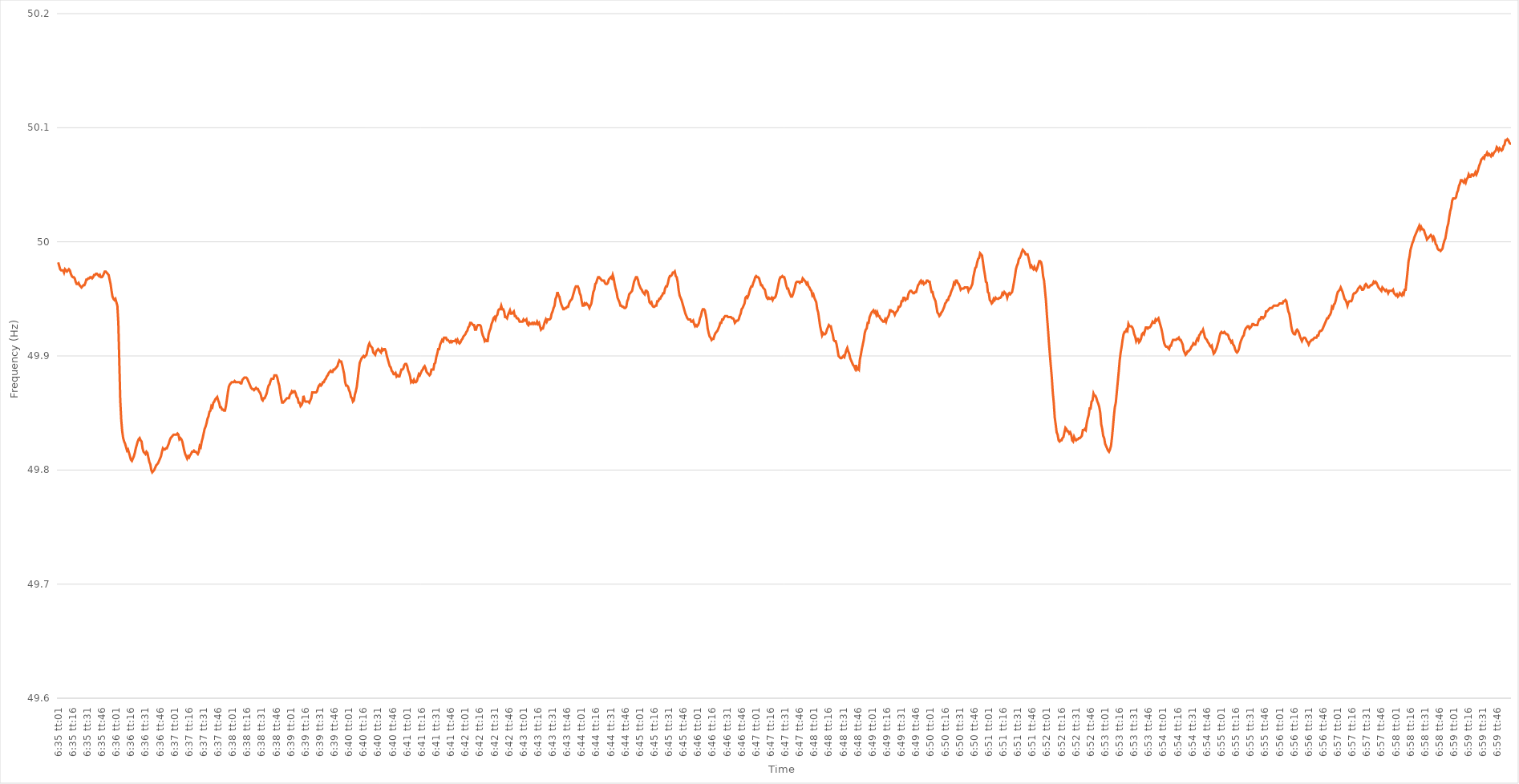
| Category | Series 0 |
|---|---|
| 0.2743171296296296 | 49.982 |
| 0.2743287037037037 | 49.979 |
| 0.27434027777777775 | 49.976 |
| 0.27435185185185185 | 49.975 |
| 0.27436342592592594 | 49.975 |
| 0.274375 | 49.975 |
| 0.2743865740740741 | 49.973 |
| 0.27439814814814817 | 49.976 |
| 0.2744097222222222 | 49.975 |
| 0.2744212962962963 | 49.974 |
| 0.2744328703703704 | 49.975 |
| 0.27444444444444444 | 49.976 |
| 0.27445601851851853 | 49.975 |
| 0.2744675925925926 | 49.972 |
| 0.27447916666666666 | 49.97 |
| 0.2744907407407407 | 49.969 |
| 0.27450231481481485 | 49.969 |
| 0.2745138888888889 | 49.968 |
| 0.274525462962963 | 49.965 |
| 0.274537037037037 | 49.963 |
| 0.2745486111111111 | 49.963 |
| 0.27456018518518516 | 49.964 |
| 0.27457175925925925 | 49.962 |
| 0.27458333333333335 | 49.961 |
| 0.2745949074074074 | 49.96 |
| 0.2746064814814815 | 49.961 |
| 0.2746180555555556 | 49.962 |
| 0.2746296296296296 | 49.962 |
| 0.2746412037037037 | 49.964 |
| 0.2746527777777778 | 49.967 |
| 0.27466435185185184 | 49.967 |
| 0.27467592592592593 | 49.968 |
| 0.27468750000000003 | 49.968 |
| 0.27469907407407407 | 49.969 |
| 0.27471064814814816 | 49.969 |
| 0.27472222222222226 | 49.968 |
| 0.2747337962962963 | 49.969 |
| 0.2747453703703704 | 49.971 |
| 0.27475694444444443 | 49.971 |
| 0.2747685185185185 | 49.972 |
| 0.27478009259259256 | 49.972 |
| 0.27479166666666666 | 49.971 |
| 0.27480324074074075 | 49.97 |
| 0.2748148148148148 | 49.971 |
| 0.2748263888888889 | 49.969 |
| 0.274837962962963 | 49.969 |
| 0.274849537037037 | 49.97 |
| 0.2748611111111111 | 49.972 |
| 0.2748726851851852 | 49.974 |
| 0.27488425925925924 | 49.974 |
| 0.27489583333333334 | 49.973 |
| 0.27490740740740743 | 49.972 |
| 0.2749189814814815 | 49.971 |
| 0.27493055555555557 | 49.967 |
| 0.27494212962962966 | 49.963 |
| 0.2749537037037037 | 49.957 |
| 0.2749652777777778 | 49.952 |
| 0.27497685185185183 | 49.95 |
| 0.27498842592592593 | 49.949 |
| 0.27499999999999997 | 49.95 |
| 0.27501157407407406 | 49.947 |
| 0.27502314814814816 | 49.944 |
| 0.2750347222222222 | 49.929 |
| 0.2750462962962963 | 49.895 |
| 0.2750578703703704 | 49.861 |
| 0.2750694444444444 | 49.844 |
| 0.2750810185185185 | 49.834 |
| 0.2750925925925926 | 49.828 |
| 0.27510416666666665 | 49.825 |
| 0.27511574074074074 | 49.823 |
| 0.27512731481481484 | 49.82 |
| 0.2751388888888889 | 49.817 |
| 0.27515046296296297 | 49.818 |
| 0.27516203703703707 | 49.815 |
| 0.2751736111111111 | 49.812 |
| 0.2751851851851852 | 49.809 |
| 0.27519675925925924 | 49.808 |
| 0.27520833333333333 | 49.81 |
| 0.27521990740740737 | 49.812 |
| 0.2752314814814815 | 49.815 |
| 0.27524305555555556 | 49.819 |
| 0.2752546296296296 | 49.822 |
| 0.2752662037037037 | 49.825 |
| 0.2752777777777778 | 49.827 |
| 0.2752893518518518 | 49.828 |
| 0.2753009259259259 | 49.826 |
| 0.2753125 | 49.825 |
| 0.27532407407407405 | 49.819 |
| 0.27533564814814815 | 49.816 |
| 0.27534722222222224 | 49.815 |
| 0.2753587962962963 | 49.814 |
| 0.2753703703703704 | 49.816 |
| 0.27538194444444447 | 49.815 |
| 0.2753935185185185 | 49.811 |
| 0.2754050925925926 | 49.807 |
| 0.2754166666666667 | 49.805 |
| 0.27542824074074074 | 49.8 |
| 0.2754398148148148 | 49.798 |
| 0.2754513888888889 | 49.799 |
| 0.27546296296296297 | 49.8 |
| 0.275474537037037 | 49.802 |
| 0.2754861111111111 | 49.804 |
| 0.2754976851851852 | 49.805 |
| 0.27550925925925923 | 49.806 |
| 0.2755208333333333 | 49.808 |
| 0.2755324074074074 | 49.81 |
| 0.27554398148148146 | 49.812 |
| 0.27555555555555555 | 49.816 |
| 0.27556712962962965 | 49.819 |
| 0.2755787037037037 | 49.818 |
| 0.2755902777777778 | 49.818 |
| 0.2756018518518519 | 49.819 |
| 0.2756134259259259 | 49.819 |
| 0.275625 | 49.821 |
| 0.2756365740740741 | 49.823 |
| 0.27564814814814814 | 49.826 |
| 0.27565972222222224 | 49.828 |
| 0.27567129629629633 | 49.829 |
| 0.27568287037037037 | 49.83 |
| 0.27569444444444446 | 49.831 |
| 0.2757060185185185 | 49.831 |
| 0.2757175925925926 | 49.831 |
| 0.27572916666666664 | 49.831 |
| 0.27574074074074073 | 49.832 |
| 0.2757523148148148 | 49.831 |
| 0.27576388888888886 | 49.827 |
| 0.27577546296296296 | 49.828 |
| 0.27578703703703705 | 49.827 |
| 0.2757986111111111 | 49.825 |
| 0.2758101851851852 | 49.821 |
| 0.2758217592592593 | 49.817 |
| 0.2758333333333333 | 49.814 |
| 0.2758449074074074 | 49.812 |
| 0.2758564814814815 | 49.81 |
| 0.27586805555555555 | 49.812 |
| 0.27587962962962964 | 49.811 |
| 0.27589120370370374 | 49.813 |
| 0.2759027777777778 | 49.814 |
| 0.27591435185185187 | 49.816 |
| 0.2759259259259259 | 49.816 |
| 0.2759375 | 49.817 |
| 0.27594907407407404 | 49.816 |
| 0.27596064814814814 | 49.816 |
| 0.27597222222222223 | 49.815 |
| 0.27598379629629627 | 49.814 |
| 0.27599537037037036 | 49.816 |
| 0.27600694444444446 | 49.821 |
| 0.2760185185185185 | 49.82 |
| 0.2760300925925926 | 49.825 |
| 0.2760416666666667 | 49.828 |
| 0.2760532407407407 | 49.832 |
| 0.2760648148148148 | 49.836 |
| 0.2760763888888889 | 49.838 |
| 0.27608796296296295 | 49.841 |
| 0.27609953703703705 | 49.845 |
| 0.27611111111111114 | 49.847 |
| 0.2761226851851852 | 49.851 |
| 0.2761342592592593 | 49.852 |
| 0.2761458333333333 | 49.856 |
| 0.2761574074074074 | 49.855 |
| 0.27616898148148145 | 49.859 |
| 0.2761805555555556 | 49.86 |
| 0.27619212962962963 | 49.862 |
| 0.2762037037037037 | 49.863 |
| 0.27621527777777777 | 49.864 |
| 0.27622685185185186 | 49.861 |
| 0.2762384259259259 | 49.859 |
| 0.27625 | 49.855 |
| 0.2762615740740741 | 49.855 |
| 0.27627314814814813 | 49.853 |
| 0.2762847222222222 | 49.853 |
| 0.2762962962962963 | 49.852 |
| 0.27630787037037036 | 49.852 |
| 0.27631944444444445 | 49.856 |
| 0.27633101851851855 | 49.862 |
| 0.2763425925925926 | 49.868 |
| 0.2763541666666667 | 49.873 |
| 0.2763657407407408 | 49.875 |
| 0.2763773148148148 | 49.876 |
| 0.27638888888888885 | 49.877 |
| 0.276400462962963 | 49.877 |
| 0.27641203703703704 | 49.877 |
| 0.2764236111111111 | 49.878 |
| 0.2764351851851852 | 49.877 |
| 0.27644675925925927 | 49.877 |
| 0.2764583333333333 | 49.877 |
| 0.2764699074074074 | 49.877 |
| 0.2764814814814815 | 49.877 |
| 0.27649305555555553 | 49.876 |
| 0.27650462962962963 | 49.876 |
| 0.2765162037037037 | 49.879 |
| 0.27652777777777776 | 49.88 |
| 0.27653935185185186 | 49.881 |
| 0.27655092592592595 | 49.881 |
| 0.2765625 | 49.881 |
| 0.2765740740740741 | 49.88 |
| 0.2765856481481482 | 49.878 |
| 0.2765972222222222 | 49.876 |
| 0.2766087962962963 | 49.874 |
| 0.2766203703703704 | 49.872 |
| 0.27663194444444444 | 49.871 |
| 0.27664351851851854 | 49.871 |
| 0.2766550925925926 | 49.87 |
| 0.27666666666666667 | 49.871 |
| 0.2766782407407407 | 49.872 |
| 0.2766898148148148 | 49.871 |
| 0.2767013888888889 | 49.871 |
| 0.27671296296296294 | 49.869 |
| 0.27672453703703703 | 49.868 |
| 0.2767361111111111 | 49.866 |
| 0.27674768518518517 | 49.862 |
| 0.27675925925925926 | 49.861 |
| 0.27677083333333335 | 49.863 |
| 0.2767824074074074 | 49.863 |
| 0.2767939814814815 | 49.865 |
| 0.2768055555555556 | 49.867 |
| 0.2768171296296296 | 49.871 |
| 0.2768287037037037 | 49.874 |
| 0.2768402777777778 | 49.875 |
| 0.27685185185185185 | 49.878 |
| 0.27686342592592594 | 49.88 |
| 0.276875 | 49.88 |
| 0.2768865740740741 | 49.88 |
| 0.2768981481481481 | 49.883 |
| 0.2769097222222222 | 49.883 |
| 0.2769212962962963 | 49.883 |
| 0.27693287037037034 | 49.881 |
| 0.27694444444444444 | 49.877 |
| 0.27695601851851853 | 49.874 |
| 0.27696759259259257 | 49.868 |
| 0.27697916666666667 | 49.863 |
| 0.27699074074074076 | 49.859 |
| 0.2770023148148148 | 49.859 |
| 0.2770138888888889 | 49.86 |
| 0.277025462962963 | 49.861 |
| 0.277037037037037 | 49.862 |
| 0.2770486111111111 | 49.863 |
| 0.2770601851851852 | 49.863 |
| 0.27707175925925925 | 49.863 |
| 0.27708333333333335 | 49.866 |
| 0.2770949074074074 | 49.867 |
| 0.2771064814814815 | 49.869 |
| 0.2771180555555555 | 49.868 |
| 0.27712962962962967 | 49.869 |
| 0.2771412037037037 | 49.869 |
| 0.27715277777777775 | 49.867 |
| 0.27716435185185184 | 49.864 |
| 0.27717592592592594 | 49.863 |
| 0.2771875 | 49.859 |
| 0.27719907407407407 | 49.859 |
| 0.27721064814814816 | 49.856 |
| 0.2772222222222222 | 49.857 |
| 0.2772337962962963 | 49.859 |
| 0.2772453703703704 | 49.865 |
| 0.27725694444444443 | 49.861 |
| 0.2772685185185185 | 49.86 |
| 0.2772800925925926 | 49.86 |
| 0.27729166666666666 | 49.86 |
| 0.27730324074074075 | 49.86 |
| 0.27731481481481485 | 49.859 |
| 0.2773263888888889 | 49.861 |
| 0.2773379629629629 | 49.863 |
| 0.2773495370370371 | 49.868 |
| 0.2773611111111111 | 49.868 |
| 0.27737268518518515 | 49.868 |
| 0.27738425925925925 | 49.868 |
| 0.27739583333333334 | 49.868 |
| 0.2774074074074074 | 49.869 |
| 0.2774189814814815 | 49.872 |
| 0.27743055555555557 | 49.874 |
| 0.2774421296296296 | 49.875 |
| 0.2774537037037037 | 49.874 |
| 0.2774652777777778 | 49.875 |
| 0.27747685185185184 | 49.877 |
| 0.27748842592592593 | 49.877 |
| 0.2775 | 49.879 |
| 0.27751157407407406 | 49.88 |
| 0.27752314814814816 | 49.882 |
| 0.27753472222222225 | 49.883 |
| 0.2775462962962963 | 49.885 |
| 0.27755787037037033 | 49.886 |
| 0.2775694444444445 | 49.887 |
| 0.2775810185185185 | 49.886 |
| 0.2775925925925926 | 49.886 |
| 0.27760416666666665 | 49.888 |
| 0.27761574074074075 | 49.888 |
| 0.2776273148148148 | 49.889 |
| 0.2776388888888889 | 49.89 |
| 0.277650462962963 | 49.891 |
| 0.277662037037037 | 49.894 |
| 0.2776736111111111 | 49.896 |
| 0.2776851851851852 | 49.895 |
| 0.27769675925925924 | 49.895 |
| 0.27770833333333333 | 49.892 |
| 0.27771990740740743 | 49.888 |
| 0.27773148148148147 | 49.884 |
| 0.27774305555555556 | 49.877 |
| 0.27775462962962966 | 49.874 |
| 0.2777662037037037 | 49.874 |
| 0.2777777777777778 | 49.873 |
| 0.2777893518518519 | 49.87 |
| 0.2778009259259259 | 49.868 |
| 0.2778125 | 49.864 |
| 0.27782407407407406 | 49.863 |
| 0.27783564814814815 | 49.86 |
| 0.2778472222222222 | 49.861 |
| 0.2778587962962963 | 49.866 |
| 0.2778703703703704 | 49.869 |
| 0.2778819444444444 | 49.873 |
| 0.2778935185185185 | 49.88 |
| 0.2779050925925926 | 49.887 |
| 0.27791666666666665 | 49.894 |
| 0.27792824074074074 | 49.896 |
| 0.27793981481481483 | 49.898 |
| 0.2779513888888889 | 49.899 |
| 0.27796296296296297 | 49.9 |
| 0.27797453703703706 | 49.899 |
| 0.2779861111111111 | 49.9 |
| 0.2779976851851852 | 49.901 |
| 0.2780092592592593 | 49.905 |
| 0.27802083333333333 | 49.909 |
| 0.2780324074074074 | 49.911 |
| 0.27804398148148146 | 49.909 |
| 0.27805555555555556 | 49.908 |
| 0.2780671296296296 | 49.907 |
| 0.2780787037037037 | 49.903 |
| 0.2780902777777778 | 49.902 |
| 0.2781018518518518 | 49.901 |
| 0.2781134259259259 | 49.904 |
| 0.278125 | 49.905 |
| 0.27813657407407405 | 49.906 |
| 0.27814814814814814 | 49.905 |
| 0.27815972222222224 | 49.904 |
| 0.2781712962962963 | 49.903 |
| 0.27818287037037037 | 49.906 |
| 0.27819444444444447 | 49.905 |
| 0.2782060185185185 | 49.906 |
| 0.2782175925925926 | 49.906 |
| 0.2782291666666667 | 49.904 |
| 0.27824074074074073 | 49.9 |
| 0.2782523148148148 | 49.897 |
| 0.2782638888888889 | 49.894 |
| 0.27827546296296296 | 49.891 |
| 0.278287037037037 | 49.89 |
| 0.27829861111111115 | 49.887 |
| 0.2783101851851852 | 49.886 |
| 0.2783217592592592 | 49.884 |
| 0.2783333333333333 | 49.884 |
| 0.2783449074074074 | 49.885 |
| 0.27835648148148145 | 49.882 |
| 0.27836805555555555 | 49.883 |
| 0.27837962962962964 | 49.882 |
| 0.2783912037037037 | 49.882 |
| 0.2784027777777778 | 49.885 |
| 0.27841435185185187 | 49.888 |
| 0.2784259259259259 | 49.888 |
| 0.2784375 | 49.889 |
| 0.2784490740740741 | 49.892 |
| 0.27846064814814814 | 49.893 |
| 0.27847222222222223 | 49.893 |
| 0.2784837962962963 | 49.891 |
| 0.27849537037037037 | 49.887 |
| 0.2785069444444444 | 49.885 |
| 0.27851851851851855 | 49.882 |
| 0.2785300925925926 | 49.877 |
| 0.2785416666666667 | 49.878 |
| 0.2785532407407407 | 49.877 |
| 0.2785648148148148 | 49.879 |
| 0.27857638888888886 | 49.877 |
| 0.27858796296296295 | 49.877 |
| 0.27859953703703705 | 49.878 |
| 0.2786111111111111 | 49.881 |
| 0.2786226851851852 | 49.884 |
| 0.2786342592592593 | 49.883 |
| 0.2786458333333333 | 49.885 |
| 0.2786574074074074 | 49.887 |
| 0.2786689814814815 | 49.888 |
| 0.27868055555555554 | 49.89 |
| 0.27869212962962964 | 49.891 |
| 0.27870370370370373 | 49.889 |
| 0.27871527777777777 | 49.886 |
| 0.27872685185185186 | 49.885 |
| 0.27873842592592596 | 49.884 |
| 0.27875 | 49.883 |
| 0.2787615740740741 | 49.884 |
| 0.27877314814814813 | 49.888 |
| 0.2787847222222222 | 49.888 |
| 0.27879629629629626 | 49.888 |
| 0.27880787037037036 | 49.893 |
| 0.27881944444444445 | 49.894 |
| 0.2788310185185185 | 49.899 |
| 0.2788425925925926 | 49.902 |
| 0.2788541666666667 | 49.906 |
| 0.2788657407407407 | 49.906 |
| 0.2788773148148148 | 49.91 |
| 0.2788888888888889 | 49.912 |
| 0.27890046296296295 | 49.914 |
| 0.27891203703703704 | 49.913 |
| 0.27892361111111114 | 49.916 |
| 0.2789351851851852 | 49.916 |
| 0.27894675925925927 | 49.916 |
| 0.27895833333333336 | 49.914 |
| 0.2789699074074074 | 49.914 |
| 0.2789814814814815 | 49.913 |
| 0.27899305555555554 | 49.912 |
| 0.27900462962962963 | 49.913 |
| 0.27901620370370367 | 49.912 |
| 0.27902777777777776 | 49.913 |
| 0.27903935185185186 | 49.913 |
| 0.2790509259259259 | 49.913 |
| 0.2790625 | 49.914 |
| 0.2790740740740741 | 49.912 |
| 0.2790856481481481 | 49.914 |
| 0.2790972222222222 | 49.912 |
| 0.2791087962962963 | 49.911 |
| 0.27912037037037035 | 49.912 |
| 0.27913194444444445 | 49.914 |
| 0.27914351851851854 | 49.915 |
| 0.2791550925925926 | 49.917 |
| 0.2791666666666667 | 49.918 |
| 0.27917824074074077 | 49.919 |
| 0.2791898148148148 | 49.921 |
| 0.2792013888888889 | 49.922 |
| 0.279212962962963 | 49.925 |
| 0.27922453703703703 | 49.926 |
| 0.2792361111111111 | 49.929 |
| 0.2792476851851852 | 49.929 |
| 0.27925925925925926 | 49.928 |
| 0.2792708333333333 | 49.927 |
| 0.2792824074074074 | 49.927 |
| 0.2792939814814815 | 49.923 |
| 0.27930555555555553 | 49.923 |
| 0.2793171296296296 | 49.926 |
| 0.2793287037037037 | 49.927 |
| 0.27934027777777776 | 49.927 |
| 0.27935185185185185 | 49.927 |
| 0.27936342592592595 | 49.926 |
| 0.279375 | 49.921 |
| 0.2793865740740741 | 49.918 |
| 0.2793981481481482 | 49.916 |
| 0.2794097222222222 | 49.913 |
| 0.2794212962962963 | 49.914 |
| 0.2794328703703704 | 49.913 |
| 0.27944444444444444 | 49.913 |
| 0.2794560185185185 | 49.919 |
| 0.27946759259259263 | 49.922 |
| 0.27947916666666667 | 49.924 |
| 0.27949074074074076 | 49.928 |
| 0.2795023148148148 | 49.93 |
| 0.2795138888888889 | 49.933 |
| 0.27952546296296293 | 49.934 |
| 0.27953703703703703 | 49.932 |
| 0.2795486111111111 | 49.935 |
| 0.27956018518518516 | 49.936 |
| 0.27957175925925926 | 49.94 |
| 0.27958333333333335 | 49.941 |
| 0.2795949074074074 | 49.941 |
| 0.2796064814814815 | 49.944 |
| 0.2796180555555556 | 49.941 |
| 0.2796296296296296 | 49.941 |
| 0.2796412037037037 | 49.939 |
| 0.2796527777777778 | 49.934 |
| 0.27966435185185184 | 49.934 |
| 0.27967592592592594 | 49.933 |
| 0.27968750000000003 | 49.936 |
| 0.27969907407407407 | 49.938 |
| 0.27971064814814817 | 49.94 |
| 0.2797222222222222 | 49.937 |
| 0.2797337962962963 | 49.937 |
| 0.27974537037037034 | 49.938 |
| 0.27975694444444443 | 49.939 |
| 0.2797685185185185 | 49.935 |
| 0.27978009259259257 | 49.935 |
| 0.27979166666666666 | 49.933 |
| 0.27980324074074076 | 49.933 |
| 0.2798148148148148 | 49.932 |
| 0.2798263888888889 | 49.93 |
| 0.279837962962963 | 49.93 |
| 0.279849537037037 | 49.93 |
| 0.2798611111111111 | 49.93 |
| 0.2798726851851852 | 49.932 |
| 0.27988425925925925 | 49.931 |
| 0.27989583333333334 | 49.931 |
| 0.27990740740740744 | 49.932 |
| 0.2799189814814815 | 49.928 |
| 0.27993055555555557 | 49.927 |
| 0.2799421296296296 | 49.929 |
| 0.2799537037037037 | 49.928 |
| 0.27996527777777774 | 49.928 |
| 0.27997685185185184 | 49.929 |
| 0.27998842592592593 | 49.928 |
| 0.27999999999999997 | 49.929 |
| 0.28001157407407407 | 49.928 |
| 0.28002314814814816 | 49.928 |
| 0.2800347222222222 | 49.93 |
| 0.2800462962962963 | 49.928 |
| 0.2800578703703704 | 49.929 |
| 0.2800694444444444 | 49.926 |
| 0.2800810185185185 | 49.923 |
| 0.2800925925925926 | 49.924 |
| 0.28010416666666665 | 49.924 |
| 0.28011574074074075 | 49.927 |
| 0.28012731481481484 | 49.93 |
| 0.2801388888888889 | 49.932 |
| 0.280150462962963 | 49.93 |
| 0.280162037037037 | 49.932 |
| 0.2801736111111111 | 49.932 |
| 0.28018518518518515 | 49.932 |
| 0.2801967592592593 | 49.933 |
| 0.28020833333333334 | 49.937 |
| 0.2802199074074074 | 49.939 |
| 0.28023148148148147 | 49.942 |
| 0.28024305555555556 | 49.944 |
| 0.2802546296296296 | 49.95 |
| 0.2802662037037037 | 49.952 |
| 0.2802777777777778 | 49.956 |
| 0.28028935185185183 | 49.953 |
| 0.2803009259259259 | 49.952 |
| 0.2803125 | 49.948 |
| 0.28032407407407406 | 49.945 |
| 0.28033564814814815 | 49.943 |
| 0.28034722222222225 | 49.941 |
| 0.2803587962962963 | 49.941 |
| 0.2803703703703704 | 49.942 |
| 0.2803819444444445 | 49.942 |
| 0.2803935185185185 | 49.943 |
| 0.28040509259259255 | 49.943 |
| 0.2804166666666667 | 49.946 |
| 0.28042824074074074 | 49.948 |
| 0.28043981481481484 | 49.949 |
| 0.2804513888888889 | 49.95 |
| 0.28046296296296297 | 49.953 |
| 0.280474537037037 | 49.956 |
| 0.2804861111111111 | 49.959 |
| 0.2804976851851852 | 49.961 |
| 0.28050925925925924 | 49.961 |
| 0.28052083333333333 | 49.961 |
| 0.2805324074074074 | 49.959 |
| 0.28054398148148146 | 49.955 |
| 0.28055555555555556 | 49.953 |
| 0.28056712962962965 | 49.948 |
| 0.2805787037037037 | 49.944 |
| 0.2805902777777778 | 49.944 |
| 0.2806018518518519 | 49.946 |
| 0.2806134259259259 | 49.945 |
| 0.280625 | 49.946 |
| 0.2806365740740741 | 49.945 |
| 0.28064814814814815 | 49.944 |
| 0.28065972222222224 | 49.942 |
| 0.2806712962962963 | 49.944 |
| 0.2806828703703704 | 49.946 |
| 0.2806944444444444 | 49.951 |
| 0.2807060185185185 | 49.956 |
| 0.2807175925925926 | 49.958 |
| 0.28072916666666664 | 49.963 |
| 0.28074074074074074 | 49.964 |
| 0.28075231481481483 | 49.967 |
| 0.28076388888888887 | 49.969 |
| 0.28077546296296296 | 49.969 |
| 0.28078703703703706 | 49.968 |
| 0.2807986111111111 | 49.967 |
| 0.2808101851851852 | 49.966 |
| 0.2808217592592593 | 49.966 |
| 0.2808333333333333 | 49.966 |
| 0.2808449074074074 | 49.964 |
| 0.2808564814814815 | 49.963 |
| 0.28086805555555555 | 49.963 |
| 0.28087962962962965 | 49.964 |
| 0.2808912037037037 | 49.967 |
| 0.2809027777777778 | 49.968 |
| 0.2809143518518518 | 49.969 |
| 0.2809259259259259 | 49.968 |
| 0.2809375 | 49.971 |
| 0.28094907407407405 | 49.968 |
| 0.28096064814814814 | 49.963 |
| 0.28097222222222223 | 49.959 |
| 0.2809837962962963 | 49.956 |
| 0.28099537037037037 | 49.951 |
| 0.28100694444444446 | 49.949 |
| 0.2810185185185185 | 49.947 |
| 0.2810300925925926 | 49.944 |
| 0.2810416666666667 | 49.944 |
| 0.28105324074074073 | 49.943 |
| 0.2810648148148148 | 49.943 |
| 0.2810763888888889 | 49.942 |
| 0.28108796296296296 | 49.942 |
| 0.28109953703703705 | 49.943 |
| 0.2811111111111111 | 49.948 |
| 0.2811226851851852 | 49.95 |
| 0.2811342592592592 | 49.954 |
| 0.2811458333333334 | 49.955 |
| 0.2811574074074074 | 49.956 |
| 0.28116898148148145 | 49.957 |
| 0.28118055555555554 | 49.961 |
| 0.28119212962962964 | 49.965 |
| 0.2812037037037037 | 49.967 |
| 0.2812152777777778 | 49.969 |
| 0.28122685185185187 | 49.969 |
| 0.2812384259259259 | 49.967 |
| 0.28125 | 49.963 |
| 0.2812615740740741 | 49.961 |
| 0.28127314814814813 | 49.959 |
| 0.2812847222222222 | 49.958 |
| 0.2812962962962963 | 49.956 |
| 0.28130787037037036 | 49.955 |
| 0.28131944444444446 | 49.954 |
| 0.28133101851851855 | 49.957 |
| 0.2813425925925926 | 49.957 |
| 0.2813541666666666 | 49.956 |
| 0.2813657407407408 | 49.952 |
| 0.2813773148148148 | 49.947 |
| 0.2813888888888889 | 49.946 |
| 0.28140046296296295 | 49.947 |
| 0.28141203703703704 | 49.944 |
| 0.2814236111111111 | 49.943 |
| 0.2814351851851852 | 49.943 |
| 0.28144675925925927 | 49.944 |
| 0.2814583333333333 | 49.944 |
| 0.2814699074074074 | 49.948 |
| 0.2814814814814815 | 49.948 |
| 0.28149305555555554 | 49.95 |
| 0.28150462962962963 | 49.95 |
| 0.2815162037037037 | 49.952 |
| 0.28152777777777777 | 49.953 |
| 0.28153935185185186 | 49.955 |
| 0.28155092592592595 | 49.955 |
| 0.2815625 | 49.959 |
| 0.2815740740740741 | 49.961 |
| 0.2815856481481482 | 49.961 |
| 0.2815972222222222 | 49.964 |
| 0.2816087962962963 | 49.968 |
| 0.28162037037037035 | 49.97 |
| 0.28163194444444445 | 49.97 |
| 0.2816435185185185 | 49.971 |
| 0.2816550925925926 | 49.973 |
| 0.2816666666666667 | 49.973 |
| 0.2816782407407407 | 49.974 |
| 0.2816898148148148 | 49.97 |
| 0.2817013888888889 | 49.969 |
| 0.28171296296296294 | 49.965 |
| 0.28172453703703704 | 49.958 |
| 0.28173611111111113 | 49.953 |
| 0.28174768518518517 | 49.951 |
| 0.28175925925925926 | 49.949 |
| 0.28177083333333336 | 49.946 |
| 0.2817824074074074 | 49.943 |
| 0.2817939814814815 | 49.94 |
| 0.2818055555555556 | 49.937 |
| 0.2818171296296296 | 49.935 |
| 0.2818287037037037 | 49.933 |
| 0.28184027777777776 | 49.932 |
| 0.28185185185185185 | 49.932 |
| 0.2818634259259259 | 49.932 |
| 0.281875 | 49.93 |
| 0.2818865740740741 | 49.93 |
| 0.2818981481481481 | 49.931 |
| 0.2819097222222222 | 49.928 |
| 0.2819212962962963 | 49.926 |
| 0.28193287037037035 | 49.927 |
| 0.28194444444444444 | 49.926 |
| 0.28195601851851854 | 49.927 |
| 0.2819675925925926 | 49.929 |
| 0.28197916666666667 | 49.933 |
| 0.28199074074074076 | 49.935 |
| 0.2820023148148148 | 49.939 |
| 0.2820138888888889 | 49.941 |
| 0.282025462962963 | 49.941 |
| 0.28203703703703703 | 49.94 |
| 0.2820486111111111 | 49.936 |
| 0.28206018518518516 | 49.931 |
| 0.28207175925925926 | 49.924 |
| 0.2820833333333333 | 49.92 |
| 0.28209490740740745 | 49.917 |
| 0.2821064814814815 | 49.916 |
| 0.2821180555555555 | 49.914 |
| 0.2821296296296296 | 49.915 |
| 0.2821412037037037 | 49.915 |
| 0.28215277777777775 | 49.918 |
| 0.28216435185185185 | 49.92 |
| 0.28217592592592594 | 49.921 |
| 0.2821875 | 49.922 |
| 0.2821990740740741 | 49.924 |
| 0.28221064814814817 | 49.926 |
| 0.2822222222222222 | 49.929 |
| 0.2822337962962963 | 49.929 |
| 0.2822453703703704 | 49.932 |
| 0.28225694444444444 | 49.932 |
| 0.28226851851851853 | 49.934 |
| 0.2822800925925926 | 49.935 |
| 0.28229166666666666 | 49.935 |
| 0.2823032407407407 | 49.935 |
| 0.28231481481481485 | 49.934 |
| 0.2823263888888889 | 49.934 |
| 0.282337962962963 | 49.934 |
| 0.282349537037037 | 49.934 |
| 0.2823611111111111 | 49.933 |
| 0.28237268518518516 | 49.933 |
| 0.28238425925925925 | 49.932 |
| 0.28239583333333335 | 49.929 |
| 0.2824074074074074 | 49.93 |
| 0.2824189814814815 | 49.931 |
| 0.2824305555555556 | 49.931 |
| 0.2824421296296296 | 49.932 |
| 0.2824537037037037 | 49.935 |
| 0.2824652777777778 | 49.937 |
| 0.28247685185185184 | 49.941 |
| 0.28248842592592593 | 49.942 |
| 0.28250000000000003 | 49.944 |
| 0.28251157407407407 | 49.946 |
| 0.28252314814814816 | 49.951 |
| 0.28253472222222226 | 49.952 |
| 0.2825462962962963 | 49.951 |
| 0.2825578703703704 | 49.953 |
| 0.28256944444444443 | 49.956 |
| 0.2825810185185185 | 49.959 |
| 0.28259259259259256 | 49.961 |
| 0.28260416666666666 | 49.961 |
| 0.28261574074074075 | 49.964 |
| 0.2826273148148148 | 49.966 |
| 0.2826388888888889 | 49.969 |
| 0.282650462962963 | 49.97 |
| 0.282662037037037 | 49.969 |
| 0.2826736111111111 | 49.969 |
| 0.2826851851851852 | 49.968 |
| 0.28269675925925924 | 49.965 |
| 0.28270833333333334 | 49.962 |
| 0.28271990740740743 | 49.962 |
| 0.2827314814814815 | 49.96 |
| 0.28274305555555557 | 49.959 |
| 0.28275462962962966 | 49.958 |
| 0.2827662037037037 | 49.954 |
| 0.2827777777777778 | 49.951 |
| 0.28278935185185183 | 49.95 |
| 0.28280092592592593 | 49.951 |
| 0.28281249999999997 | 49.95 |
| 0.28282407407407406 | 49.95 |
| 0.28283564814814816 | 49.951 |
| 0.2828472222222222 | 49.949 |
| 0.2828587962962963 | 49.951 |
| 0.2828703703703704 | 49.951 |
| 0.2828819444444444 | 49.952 |
| 0.2828935185185185 | 49.955 |
| 0.2829050925925926 | 49.959 |
| 0.28291666666666665 | 49.963 |
| 0.28292824074074074 | 49.967 |
| 0.28293981481481484 | 49.969 |
| 0.2829513888888889 | 49.969 |
| 0.28296296296296297 | 49.97 |
| 0.28297453703703707 | 49.969 |
| 0.2829861111111111 | 49.969 |
| 0.2829976851851852 | 49.966 |
| 0.28300925925925924 | 49.962 |
| 0.28302083333333333 | 49.959 |
| 0.28303240740740737 | 49.959 |
| 0.2830439814814815 | 49.956 |
| 0.28305555555555556 | 49.954 |
| 0.2830671296296296 | 49.952 |
| 0.2830787037037037 | 49.952 |
| 0.2830902777777778 | 49.954 |
| 0.2831018518518518 | 49.957 |
| 0.2831134259259259 | 49.96 |
| 0.283125 | 49.964 |
| 0.28313657407407405 | 49.965 |
| 0.28314814814814815 | 49.965 |
| 0.28315972222222224 | 49.965 |
| 0.2831712962962963 | 49.964 |
| 0.2831828703703704 | 49.965 |
| 0.28319444444444447 | 49.965 |
| 0.2832060185185185 | 49.968 |
| 0.2832175925925926 | 49.967 |
| 0.2832291666666667 | 49.966 |
| 0.28324074074074074 | 49.965 |
| 0.2832523148148148 | 49.963 |
| 0.2832638888888889 | 49.964 |
| 0.28327546296296297 | 49.961 |
| 0.283287037037037 | 49.96 |
| 0.2832986111111111 | 49.958 |
| 0.2833101851851852 | 49.957 |
| 0.28332175925925923 | 49.953 |
| 0.2833333333333333 | 49.954 |
| 0.2833449074074074 | 49.951 |
| 0.28335648148148146 | 49.949 |
| 0.28336805555555555 | 49.947 |
| 0.28337962962962965 | 49.941 |
| 0.2833912037037037 | 49.938 |
| 0.2834027777777778 | 49.932 |
| 0.2834143518518519 | 49.926 |
| 0.2834259259259259 | 49.922 |
| 0.2834375 | 49.918 |
| 0.2834490740740741 | 49.92 |
| 0.28346064814814814 | 49.919 |
| 0.28347222222222224 | 49.919 |
| 0.28348379629629633 | 49.92 |
| 0.28349537037037037 | 49.923 |
| 0.28350694444444446 | 49.925 |
| 0.2835185185185185 | 49.927 |
| 0.2835300925925926 | 49.926 |
| 0.28354166666666664 | 49.926 |
| 0.28355324074074073 | 49.922 |
| 0.2835648148148148 | 49.919 |
| 0.28357638888888886 | 49.914 |
| 0.28358796296296296 | 49.913 |
| 0.28359953703703705 | 49.913 |
| 0.2836111111111111 | 49.91 |
| 0.2836226851851852 | 49.905 |
| 0.2836342592592593 | 49.9 |
| 0.2836458333333333 | 49.899 |
| 0.2836574074074074 | 49.898 |
| 0.2836689814814815 | 49.898 |
| 0.28368055555555555 | 49.899 |
| 0.28369212962962964 | 49.9 |
| 0.28370370370370374 | 49.899 |
| 0.2837152777777778 | 49.902 |
| 0.28372685185185187 | 49.905 |
| 0.2837384259259259 | 49.907 |
| 0.28375 | 49.904 |
| 0.28376157407407404 | 49.902 |
| 0.28377314814814814 | 49.898 |
| 0.28378472222222223 | 49.896 |
| 0.28379629629629627 | 49.894 |
| 0.28380787037037036 | 49.892 |
| 0.28381944444444446 | 49.891 |
| 0.2838310185185185 | 49.889 |
| 0.2838425925925926 | 49.892 |
| 0.2838541666666667 | 49.888 |
| 0.2838657407407407 | 49.889 |
| 0.2838773148148148 | 49.888 |
| 0.2838888888888889 | 49.897 |
| 0.28390046296296295 | 49.901 |
| 0.28391203703703705 | 49.906 |
| 0.28392361111111114 | 49.91 |
| 0.2839351851851852 | 49.914 |
| 0.2839467592592593 | 49.92 |
| 0.2839583333333333 | 49.923 |
| 0.2839699074074074 | 49.924 |
| 0.28398148148148145 | 49.929 |
| 0.2839930555555556 | 49.929 |
| 0.28400462962962963 | 49.934 |
| 0.2840162037037037 | 49.936 |
| 0.28402777777777777 | 49.938 |
| 0.28403935185185186 | 49.939 |
| 0.2840509259259259 | 49.94 |
| 0.2840625 | 49.938 |
| 0.2840740740740741 | 49.939 |
| 0.28408564814814813 | 49.936 |
| 0.2840972222222222 | 49.938 |
| 0.2841087962962963 | 49.935 |
| 0.28412037037037036 | 49.935 |
| 0.28413194444444445 | 49.933 |
| 0.28414351851851855 | 49.932 |
| 0.2841550925925926 | 49.931 |
| 0.2841666666666667 | 49.93 |
| 0.2841782407407408 | 49.93 |
| 0.2841898148148148 | 49.932 |
| 0.28420138888888885 | 49.93 |
| 0.284212962962963 | 49.933 |
| 0.28422453703703704 | 49.934 |
| 0.2842361111111111 | 49.936 |
| 0.2842476851851852 | 49.94 |
| 0.28425925925925927 | 49.94 |
| 0.2842708333333333 | 49.939 |
| 0.2842824074074074 | 49.939 |
| 0.2842939814814815 | 49.938 |
| 0.28430555555555553 | 49.936 |
| 0.28431712962962963 | 49.938 |
| 0.2843287037037037 | 49.939 |
| 0.28434027777777776 | 49.94 |
| 0.28435185185185186 | 49.943 |
| 0.28436342592592595 | 49.943 |
| 0.284375 | 49.944 |
| 0.2843865740740741 | 49.948 |
| 0.2843981481481482 | 49.948 |
| 0.2844097222222222 | 49.951 |
| 0.2844212962962963 | 49.951 |
| 0.2844328703703704 | 49.949 |
| 0.28444444444444444 | 49.95 |
| 0.28445601851851854 | 49.95 |
| 0.2844675925925926 | 49.954 |
| 0.28447916666666667 | 49.956 |
| 0.2844907407407407 | 49.957 |
| 0.2845023148148148 | 49.957 |
| 0.2845138888888889 | 49.956 |
| 0.28452546296296294 | 49.955 |
| 0.28453703703703703 | 49.955 |
| 0.2845486111111111 | 49.956 |
| 0.28456018518518517 | 49.956 |
| 0.28457175925925926 | 49.959 |
| 0.28458333333333335 | 49.962 |
| 0.2845949074074074 | 49.963 |
| 0.2846064814814815 | 49.965 |
| 0.2846180555555556 | 49.966 |
| 0.2846296296296296 | 49.964 |
| 0.2846412037037037 | 49.965 |
| 0.2846527777777778 | 49.963 |
| 0.28466435185185185 | 49.964 |
| 0.28467592592592594 | 49.964 |
| 0.2846875 | 49.966 |
| 0.2846990740740741 | 49.966 |
| 0.2847106481481481 | 49.965 |
| 0.2847222222222222 | 49.965 |
| 0.2847337962962963 | 49.96 |
| 0.28474537037037034 | 49.956 |
| 0.28475694444444444 | 49.956 |
| 0.28476851851851853 | 49.952 |
| 0.28478009259259257 | 49.95 |
| 0.28479166666666667 | 49.948 |
| 0.28480324074074076 | 49.943 |
| 0.2848148148148148 | 49.938 |
| 0.2848263888888889 | 49.937 |
| 0.284837962962963 | 49.935 |
| 0.284849537037037 | 49.936 |
| 0.2848611111111111 | 49.938 |
| 0.2848726851851852 | 49.939 |
| 0.28488425925925925 | 49.941 |
| 0.28489583333333335 | 49.943 |
| 0.2849074074074074 | 49.946 |
| 0.2849189814814815 | 49.947 |
| 0.2849305555555555 | 49.949 |
| 0.28494212962962967 | 49.949 |
| 0.2849537037037037 | 49.952 |
| 0.28496527777777775 | 49.953 |
| 0.28497685185185184 | 49.956 |
| 0.28498842592592594 | 49.958 |
| 0.285 | 49.96 |
| 0.28501157407407407 | 49.964 |
| 0.28502314814814816 | 49.963 |
| 0.2850347222222222 | 49.966 |
| 0.2850462962962963 | 49.966 |
| 0.2850578703703704 | 49.964 |
| 0.28506944444444443 | 49.963 |
| 0.2850810185185185 | 49.961 |
| 0.2850925925925926 | 49.958 |
| 0.28510416666666666 | 49.959 |
| 0.28511574074074075 | 49.959 |
| 0.28512731481481485 | 49.959 |
| 0.2851388888888889 | 49.96 |
| 0.2851504629629629 | 49.96 |
| 0.2851620370370371 | 49.96 |
| 0.2851736111111111 | 49.96 |
| 0.28518518518518515 | 49.957 |
| 0.28519675925925925 | 49.959 |
| 0.28520833333333334 | 49.959 |
| 0.2852199074074074 | 49.961 |
| 0.2852314814814815 | 49.963 |
| 0.28524305555555557 | 49.969 |
| 0.2852546296296296 | 49.973 |
| 0.2852662037037037 | 49.977 |
| 0.2852777777777778 | 49.978 |
| 0.28528935185185184 | 49.982 |
| 0.28530092592592593 | 49.985 |
| 0.2853125 | 49.986 |
| 0.28532407407407406 | 49.99 |
| 0.28533564814814816 | 49.989 |
| 0.28534722222222225 | 49.988 |
| 0.2853587962962963 | 49.982 |
| 0.28537037037037033 | 49.976 |
| 0.2853819444444445 | 49.971 |
| 0.2853935185185185 | 49.965 |
| 0.2854050925925926 | 49.964 |
| 0.28541666666666665 | 49.956 |
| 0.28542824074074075 | 49.955 |
| 0.2854398148148148 | 49.949 |
| 0.2854513888888889 | 49.948 |
| 0.285462962962963 | 49.946 |
| 0.285474537037037 | 49.947 |
| 0.2854861111111111 | 49.95 |
| 0.2854976851851852 | 49.949 |
| 0.28550925925925924 | 49.951 |
| 0.28552083333333333 | 49.95 |
| 0.28553240740740743 | 49.95 |
| 0.28554398148148147 | 49.95 |
| 0.28555555555555556 | 49.951 |
| 0.28556712962962966 | 49.951 |
| 0.2855787037037037 | 49.952 |
| 0.2855902777777778 | 49.955 |
| 0.2856018518518519 | 49.954 |
| 0.2856134259259259 | 49.956 |
| 0.285625 | 49.955 |
| 0.28563657407407406 | 49.954 |
| 0.28564814814814815 | 49.951 |
| 0.2856597222222222 | 49.954 |
| 0.2856712962962963 | 49.955 |
| 0.2856828703703704 | 49.954 |
| 0.2856944444444444 | 49.955 |
| 0.2857060185185185 | 49.956 |
| 0.2857175925925926 | 49.96 |
| 0.28572916666666665 | 49.965 |
| 0.28574074074074074 | 49.97 |
| 0.28575231481481483 | 49.976 |
| 0.2857638888888889 | 49.979 |
| 0.28577546296296297 | 49.981 |
| 0.28578703703703706 | 49.985 |
| 0.2857986111111111 | 49.986 |
| 0.2858101851851852 | 49.988 |
| 0.2858217592592593 | 49.991 |
| 0.28583333333333333 | 49.993 |
| 0.2858449074074074 | 49.992 |
| 0.28585648148148146 | 49.991 |
| 0.28586805555555556 | 49.989 |
| 0.2858796296296296 | 49.989 |
| 0.2858912037037037 | 49.989 |
| 0.2859027777777778 | 49.986 |
| 0.2859143518518518 | 49.982 |
| 0.2859259259259259 | 49.978 |
| 0.2859375 | 49.979 |
| 0.28594907407407405 | 49.977 |
| 0.28596064814814814 | 49.976 |
| 0.28597222222222224 | 49.978 |
| 0.2859837962962963 | 49.976 |
| 0.28599537037037037 | 49.975 |
| 0.28600694444444447 | 49.977 |
| 0.2860185185185185 | 49.98 |
| 0.2860300925925926 | 49.983 |
| 0.2860416666666667 | 49.983 |
| 0.28605324074074073 | 49.982 |
| 0.2860648148148148 | 49.978 |
| 0.2860763888888889 | 49.97 |
| 0.28608796296296296 | 49.966 |
| 0.286099537037037 | 49.957 |
| 0.28611111111111115 | 49.948 |
| 0.2861226851851852 | 49.935 |
| 0.2861342592592592 | 49.924 |
| 0.2861458333333333 | 49.912 |
| 0.2861574074074074 | 49.901 |
| 0.28616898148148145 | 49.891 |
| 0.28618055555555555 | 49.881 |
| 0.28619212962962964 | 49.868 |
| 0.2862037037037037 | 49.859 |
| 0.2862152777777778 | 49.846 |
| 0.28622685185185187 | 49.84 |
| 0.2862384259259259 | 49.833 |
| 0.28625 | 49.831 |
| 0.2862615740740741 | 49.826 |
| 0.28627314814814814 | 49.825 |
| 0.28628472222222223 | 49.826 |
| 0.2862962962962963 | 49.826 |
| 0.28630787037037037 | 49.828 |
| 0.2863194444444444 | 49.829 |
| 0.28633101851851855 | 49.833 |
| 0.2863425925925926 | 49.837 |
| 0.2863541666666667 | 49.836 |
| 0.2863657407407407 | 49.834 |
| 0.2863773148148148 | 49.834 |
| 0.28638888888888886 | 49.832 |
| 0.28640046296296295 | 49.833 |
| 0.28641203703703705 | 49.831 |
| 0.2864236111111111 | 49.826 |
| 0.2864351851851852 | 49.825 |
| 0.2864467592592593 | 49.829 |
| 0.2864583333333333 | 49.827 |
| 0.2864699074074074 | 49.826 |
| 0.2864814814814815 | 49.827 |
| 0.28649305555555554 | 49.827 |
| 0.28650462962962964 | 49.828 |
| 0.28651620370370373 | 49.828 |
| 0.28652777777777777 | 49.829 |
| 0.28653935185185186 | 49.83 |
| 0.28655092592592596 | 49.835 |
| 0.2865625 | 49.835 |
| 0.2865740740740741 | 49.836 |
| 0.28658564814814813 | 49.835 |
| 0.2865972222222222 | 49.841 |
| 0.28660879629629626 | 49.845 |
| 0.28662037037037036 | 49.848 |
| 0.28663194444444445 | 49.854 |
| 0.2866435185185185 | 49.854 |
| 0.2866550925925926 | 49.86 |
| 0.2866666666666667 | 49.861 |
| 0.2866782407407407 | 49.867 |
| 0.2866898148148148 | 49.865 |
| 0.2867013888888889 | 49.865 |
| 0.28671296296296295 | 49.863 |
| 0.28672453703703704 | 49.86 |
| 0.28673611111111114 | 49.858 |
| 0.2867476851851852 | 49.855 |
| 0.28675925925925927 | 49.85 |
| 0.28677083333333336 | 49.84 |
| 0.2867824074074074 | 49.836 |
| 0.2867939814814815 | 49.83 |
| 0.28680555555555554 | 49.828 |
| 0.28681712962962963 | 49.823 |
| 0.28682870370370367 | 49.821 |
| 0.28684027777777776 | 49.819 |
| 0.28685185185185186 | 49.817 |
| 0.2868634259259259 | 49.816 |
| 0.286875 | 49.818 |
| 0.2868865740740741 | 49.821 |
| 0.2868981481481481 | 49.828 |
| 0.2869097222222222 | 49.837 |
| 0.2869212962962963 | 49.847 |
| 0.28693287037037035 | 49.855 |
| 0.28694444444444445 | 49.859 |
| 0.28695601851851854 | 49.868 |
| 0.2869675925925926 | 49.877 |
| 0.2869791666666667 | 49.886 |
| 0.28699074074074077 | 49.896 |
| 0.2870023148148148 | 49.903 |
| 0.2870138888888889 | 49.908 |
| 0.287025462962963 | 49.914 |
| 0.28703703703703703 | 49.919 |
| 0.2870486111111111 | 49.921 |
| 0.2870601851851852 | 49.921 |
| 0.28707175925925926 | 49.923 |
| 0.2870833333333333 | 49.922 |
| 0.2870949074074074 | 49.928 |
| 0.2871064814814815 | 49.926 |
| 0.28711805555555553 | 49.926 |
| 0.2871296296296296 | 49.926 |
| 0.2871412037037037 | 49.925 |
| 0.28715277777777776 | 49.923 |
| 0.28716435185185185 | 49.919 |
| 0.28717592592592595 | 49.917 |
| 0.2871875 | 49.913 |
| 0.2871990740740741 | 49.915 |
| 0.2872106481481482 | 49.915 |
| 0.2872222222222222 | 49.912 |
| 0.2872337962962963 | 49.913 |
| 0.2872453703703704 | 49.915 |
| 0.28725694444444444 | 49.919 |
| 0.2872685185185185 | 49.92 |
| 0.28728009259259263 | 49.919 |
| 0.28729166666666667 | 49.922 |
| 0.28730324074074076 | 49.925 |
| 0.2873148148148148 | 49.925 |
| 0.2873263888888889 | 49.924 |
| 0.28733796296296293 | 49.925 |
| 0.28734953703703703 | 49.925 |
| 0.2873611111111111 | 49.926 |
| 0.28737268518518516 | 49.928 |
| 0.28738425925925926 | 49.93 |
| 0.28739583333333335 | 49.929 |
| 0.2874074074074074 | 49.929 |
| 0.2874189814814815 | 49.932 |
| 0.2874305555555556 | 49.931 |
| 0.2874421296296296 | 49.932 |
| 0.2874537037037037 | 49.933 |
| 0.2874652777777778 | 49.93 |
| 0.28747685185185184 | 49.927 |
| 0.28748842592592594 | 49.924 |
| 0.28750000000000003 | 49.92 |
| 0.28751157407407407 | 49.915 |
| 0.28752314814814817 | 49.911 |
| 0.2875347222222222 | 49.909 |
| 0.2875462962962963 | 49.908 |
| 0.28755787037037034 | 49.908 |
| 0.28756944444444443 | 49.907 |
| 0.2875810185185185 | 49.906 |
| 0.28759259259259257 | 49.909 |
| 0.28760416666666666 | 49.909 |
| 0.28761574074074076 | 49.912 |
| 0.2876273148148148 | 49.914 |
| 0.2876388888888889 | 49.914 |
| 0.287650462962963 | 49.914 |
| 0.287662037037037 | 49.914 |
| 0.2876736111111111 | 49.915 |
| 0.2876851851851852 | 49.915 |
| 0.28769675925925925 | 49.916 |
| 0.28770833333333334 | 49.914 |
| 0.28771990740740744 | 49.914 |
| 0.2877314814814815 | 49.912 |
| 0.28774305555555557 | 49.91 |
| 0.2877546296296296 | 49.905 |
| 0.2877662037037037 | 49.903 |
| 0.28777777777777774 | 49.901 |
| 0.28778935185185184 | 49.902 |
| 0.28780092592592593 | 49.904 |
| 0.28781249999999997 | 49.904 |
| 0.28782407407407407 | 49.905 |
| 0.28783564814814816 | 49.906 |
| 0.2878472222222222 | 49.908 |
| 0.2878587962962963 | 49.909 |
| 0.2878703703703704 | 49.911 |
| 0.2878819444444444 | 49.91 |
| 0.2878935185185185 | 49.91 |
| 0.2879050925925926 | 49.913 |
| 0.28791666666666665 | 49.915 |
| 0.28792824074074075 | 49.914 |
| 0.28793981481481484 | 49.918 |
| 0.2879513888888889 | 49.919 |
| 0.287962962962963 | 49.921 |
| 0.287974537037037 | 49.921 |
| 0.2879861111111111 | 49.923 |
| 0.28799768518518515 | 49.92 |
| 0.2880092592592593 | 49.916 |
| 0.28802083333333334 | 49.915 |
| 0.2880324074074074 | 49.914 |
| 0.28804398148148147 | 49.912 |
| 0.28805555555555556 | 49.911 |
| 0.2880671296296296 | 49.909 |
| 0.2880787037037037 | 49.908 |
| 0.2880902777777778 | 49.909 |
| 0.28810185185185183 | 49.905 |
| 0.2881134259259259 | 49.902 |
| 0.288125 | 49.903 |
| 0.28813657407407406 | 49.905 |
| 0.28814814814814815 | 49.907 |
| 0.28815972222222225 | 49.91 |
| 0.2881712962962963 | 49.913 |
| 0.2881828703703704 | 49.917 |
| 0.2881944444444445 | 49.92 |
| 0.2882060185185185 | 49.921 |
| 0.28821759259259255 | 49.92 |
| 0.2882291666666667 | 49.92 |
| 0.28824074074074074 | 49.921 |
| 0.28825231481481484 | 49.92 |
| 0.2882638888888889 | 49.919 |
| 0.28827546296296297 | 49.919 |
| 0.288287037037037 | 49.918 |
| 0.2882986111111111 | 49.915 |
| 0.2883101851851852 | 49.914 |
| 0.28832175925925924 | 49.912 |
| 0.28833333333333333 | 49.913 |
| 0.2883449074074074 | 49.91 |
| 0.28835648148148146 | 49.909 |
| 0.28836805555555556 | 49.906 |
| 0.28837962962962965 | 49.904 |
| 0.2883912037037037 | 49.903 |
| 0.2884027777777778 | 49.904 |
| 0.2884143518518519 | 49.906 |
| 0.2884259259259259 | 49.91 |
| 0.2884375 | 49.913 |
| 0.2884490740740741 | 49.915 |
| 0.28846064814814815 | 49.917 |
| 0.28847222222222224 | 49.918 |
| 0.2884837962962963 | 49.922 |
| 0.2884953703703704 | 49.924 |
| 0.2885069444444444 | 49.925 |
| 0.2885185185185185 | 49.926 |
| 0.2885300925925926 | 49.926 |
| 0.28854166666666664 | 49.924 |
| 0.28855324074074074 | 49.925 |
| 0.28856481481481483 | 49.926 |
| 0.28857638888888887 | 49.928 |
| 0.28858796296296296 | 49.928 |
| 0.28859953703703706 | 49.927 |
| 0.2886111111111111 | 49.927 |
| 0.2886226851851852 | 49.927 |
| 0.2886342592592593 | 49.927 |
| 0.2886458333333333 | 49.93 |
| 0.2886574074074074 | 49.932 |
| 0.2886689814814815 | 49.932 |
| 0.28868055555555555 | 49.934 |
| 0.28869212962962965 | 49.934 |
| 0.2887037037037037 | 49.933 |
| 0.2887152777777778 | 49.934 |
| 0.2887268518518518 | 49.935 |
| 0.2887384259259259 | 49.939 |
| 0.28875 | 49.939 |
| 0.28876157407407405 | 49.94 |
| 0.28877314814814814 | 49.941 |
| 0.28878472222222223 | 49.942 |
| 0.2887962962962963 | 49.942 |
| 0.28880787037037037 | 49.942 |
| 0.28881944444444446 | 49.943 |
| 0.2888310185185185 | 49.944 |
| 0.2888425925925926 | 49.944 |
| 0.2888541666666667 | 49.944 |
| 0.28886574074074073 | 49.944 |
| 0.2888773148148148 | 49.944 |
| 0.2888888888888889 | 49.945 |
| 0.28890046296296296 | 49.946 |
| 0.28891203703703705 | 49.946 |
| 0.2889236111111111 | 49.946 |
| 0.2889351851851852 | 49.946 |
| 0.2889467592592592 | 49.948 |
| 0.2889583333333334 | 49.948 |
| 0.2889699074074074 | 49.949 |
| 0.28898148148148145 | 49.948 |
| 0.28899305555555554 | 49.943 |
| 0.28900462962962964 | 49.939 |
| 0.2890162037037037 | 49.937 |
| 0.2890277777777778 | 49.932 |
| 0.28903935185185187 | 49.926 |
| 0.2890509259259259 | 49.922 |
| 0.2890625 | 49.92 |
| 0.2890740740740741 | 49.919 |
| 0.28908564814814813 | 49.919 |
| 0.2890972222222222 | 49.922 |
| 0.2891087962962963 | 49.923 |
| 0.28912037037037036 | 49.922 |
| 0.28913194444444446 | 49.92 |
| 0.28914351851851855 | 49.917 |
| 0.2891550925925926 | 49.915 |
| 0.2891666666666666 | 49.913 |
| 0.2891782407407408 | 49.915 |
| 0.2891898148148148 | 49.916 |
| 0.2892013888888889 | 49.916 |
| 0.28921296296296295 | 49.915 |
| 0.28922453703703704 | 49.913 |
| 0.2892361111111111 | 49.912 |
| 0.2892476851851852 | 49.91 |
| 0.28925925925925927 | 49.912 |
| 0.2892708333333333 | 49.913 |
| 0.2892824074074074 | 49.914 |
| 0.2892939814814815 | 49.914 |
| 0.28930555555555554 | 49.915 |
| 0.28931712962962963 | 49.916 |
| 0.2893287037037037 | 49.916 |
| 0.28934027777777777 | 49.916 |
| 0.28935185185185186 | 49.918 |
| 0.28936342592592595 | 49.918 |
| 0.289375 | 49.921 |
| 0.2893865740740741 | 49.922 |
| 0.2893981481481482 | 49.922 |
| 0.2894097222222222 | 49.923 |
| 0.2894212962962963 | 49.925 |
| 0.28943287037037035 | 49.927 |
| 0.28944444444444445 | 49.929 |
| 0.2894560185185185 | 49.931 |
| 0.2894675925925926 | 49.933 |
| 0.2894791666666667 | 49.933 |
| 0.2894907407407407 | 49.935 |
| 0.2895023148148148 | 49.936 |
| 0.2895138888888889 | 49.938 |
| 0.28952546296296294 | 49.943 |
| 0.28953703703703704 | 49.942 |
| 0.28954861111111113 | 49.945 |
| 0.28956018518518517 | 49.946 |
| 0.28957175925925926 | 49.949 |
| 0.28958333333333336 | 49.953 |
| 0.2895949074074074 | 49.956 |
| 0.2896064814814815 | 49.957 |
| 0.2896180555555556 | 49.958 |
| 0.2896296296296296 | 49.96 |
| 0.2896412037037037 | 49.958 |
| 0.28965277777777776 | 49.956 |
| 0.28966435185185185 | 49.953 |
| 0.2896759259259259 | 49.95 |
| 0.2896875 | 49.949 |
| 0.2896990740740741 | 49.947 |
| 0.2897106481481481 | 49.944 |
| 0.2897222222222222 | 49.947 |
| 0.2897337962962963 | 49.948 |
| 0.28974537037037035 | 49.948 |
| 0.28975694444444444 | 49.948 |
| 0.28976851851851854 | 49.95 |
| 0.2897800925925926 | 49.954 |
| 0.28979166666666667 | 49.955 |
| 0.28980324074074076 | 49.955 |
| 0.2898148148148148 | 49.956 |
| 0.2898263888888889 | 49.957 |
| 0.289837962962963 | 49.959 |
| 0.28984953703703703 | 49.96 |
| 0.2898611111111111 | 49.961 |
| 0.28987268518518516 | 49.96 |
| 0.28988425925925926 | 49.958 |
| 0.2898958333333333 | 49.958 |
| 0.28990740740740745 | 49.959 |
| 0.2899189814814815 | 49.962 |
| 0.2899305555555555 | 49.963 |
| 0.2899421296296296 | 49.962 |
| 0.2899537037037037 | 49.96 |
| 0.28996527777777775 | 49.96 |
| 0.28997685185185185 | 49.961 |
| 0.28998842592592594 | 49.962 |
| 0.29 | 49.962 |
| 0.2900115740740741 | 49.963 |
| 0.29002314814814817 | 49.965 |
| 0.2900347222222222 | 49.964 |
| 0.2900462962962963 | 49.965 |
| 0.2900578703703704 | 49.964 |
| 0.29006944444444444 | 49.962 |
| 0.29008101851851853 | 49.96 |
| 0.2900925925925926 | 49.959 |
| 0.29010416666666666 | 49.958 |
| 0.2901157407407407 | 49.957 |
| 0.29012731481481485 | 49.96 |
| 0.2901388888888889 | 49.959 |
| 0.290150462962963 | 49.958 |
| 0.290162037037037 | 49.957 |
| 0.2901736111111111 | 49.958 |
| 0.29018518518518516 | 49.957 |
| 0.29019675925925925 | 49.955 |
| 0.29020833333333335 | 49.957 |
| 0.2902199074074074 | 49.957 |
| 0.2902314814814815 | 49.957 |
| 0.2902430555555556 | 49.957 |
| 0.2902546296296296 | 49.958 |
| 0.2902662037037037 | 49.955 |
| 0.2902777777777778 | 49.954 |
| 0.29028935185185184 | 49.953 |
| 0.29030092592592593 | 49.954 |
| 0.29031250000000003 | 49.952 |
| 0.29032407407407407 | 49.953 |
| 0.29033564814814816 | 49.955 |
| 0.29034722222222226 | 49.954 |
| 0.2903587962962963 | 49.953 |
| 0.2903703703703704 | 49.955 |
| 0.29038194444444443 | 49.954 |
| 0.2903935185185185 | 49.958 |
| 0.29040509259259256 | 49.958 |
| 0.29041666666666666 | 49.966 |
| 0.29042824074074075 | 49.974 |
| 0.2904398148148148 | 49.983 |
| 0.2904513888888889 | 49.987 |
| 0.290462962962963 | 49.993 |
| 0.290474537037037 | 49.996 |
| 0.2904861111111111 | 49.999 |
| 0.2904976851851852 | 50.001 |
| 0.29050925925925924 | 50.004 |
| 0.29052083333333334 | 50.006 |
| 0.29053240740740743 | 50.008 |
| 0.2905439814814815 | 50.01 |
| 0.29055555555555557 | 50.012 |
| 0.29056712962962966 | 50.014 |
| 0.2905787037037037 | 50.011 |
| 0.2905902777777778 | 50.013 |
| 0.29060185185185183 | 50.011 |
| 0.29061342592592593 | 50.011 |
| 0.29062499999999997 | 50.01 |
| 0.29063657407407406 | 50.007 |
| 0.29064814814814816 | 50.005 |
| 0.2906597222222222 | 50.002 |
| 0.2906712962962963 | 50.003 |
| 0.2906828703703704 | 50.004 |
| 0.2906944444444444 | 50.005 |
| 0.2907060185185185 | 50.006 |
| 0.2907175925925926 | 50.005 |
| 0.29072916666666665 | 50.002 |
| 0.29074074074074074 | 50.004 |
| 0.29075231481481484 | 50.002 |
| 0.2907638888888889 | 49.998 |
| 0.29077546296296297 | 49.997 |
| 0.29078703703703707 | 49.994 |
| 0.2907986111111111 | 49.993 |
| 0.2908101851851852 | 49.993 |
| 0.29082175925925924 | 49.992 |
| 0.29083333333333333 | 49.993 |
| 0.29084490740740737 | 49.994 |
| 0.2908564814814815 | 49.998 |
| 0.29086805555555556 | 50.001 |
| 0.2908796296296296 | 50.003 |
| 0.2908912037037037 | 50.008 |
| 0.2909027777777778 | 50.013 |
| 0.2909143518518518 | 50.016 |
| 0.2909259259259259 | 50.022 |
| 0.2909375 | 50.027 |
| 0.29094907407407405 | 50.03 |
| 0.29096064814814815 | 50.036 |
| 0.29097222222222224 | 50.038 |
| 0.2909837962962963 | 50.038 |
| 0.2909953703703704 | 50.038 |
| 0.29100694444444447 | 50.039 |
| 0.2910185185185185 | 50.043 |
| 0.2910300925925926 | 50.045 |
| 0.2910416666666667 | 50.049 |
| 0.29105324074074074 | 50.051 |
| 0.2910648148148148 | 50.054 |
| 0.2910763888888889 | 50.054 |
| 0.29108796296296297 | 50.053 |
| 0.291099537037037 | 50.052 |
| 0.2911111111111111 | 50.054 |
| 0.2911226851851852 | 50.052 |
| 0.29113425925925923 | 50.055 |
| 0.2911458333333333 | 50.056 |
| 0.2911574074074074 | 50.059 |
| 0.29116898148148146 | 50.057 |
| 0.29118055555555555 | 50.057 |
| 0.29119212962962965 | 50.059 |
| 0.2912037037037037 | 50.059 |
| 0.2912152777777778 | 50.058 |
| 0.2912268518518519 | 50.059 |
| 0.2912384259259259 | 50.061 |
| 0.29125 | 50.059 |
| 0.2912615740740741 | 50.061 |
| 0.29127314814814814 | 50.064 |
| 0.29128472222222224 | 50.067 |
| 0.29129629629629633 | 50.069 |
| 0.29130787037037037 | 50.072 |
| 0.29131944444444446 | 50.073 |
| 0.2913310185185185 | 50.074 |
| 0.2913425925925926 | 50.073 |
| 0.29135416666666664 | 50.076 |
| 0.29136574074074073 | 50.076 |
| 0.2913773148148148 | 50.078 |
| 0.29138888888888886 | 50.076 |
| 0.29140046296296296 | 50.077 |
| 0.29141203703703705 | 50.076 |
| 0.2914236111111111 | 50.075 |
| 0.2914351851851852 | 50.077 |
| 0.2914467592592593 | 50.076 |
| 0.2914583333333333 | 50.078 |
| 0.2914699074074074 | 50.079 |
| 0.2914814814814815 | 50.08 |
| 0.29149305555555555 | 50.083 |
| 0.29150462962962964 | 50.082 |
| 0.29151620370370374 | 50.08 |
| 0.2915277777777778 | 50.082 |
| 0.29153935185185187 | 50.081 |
| 0.2915509259259259 | 50.08 |
| 0.2915625 | 50.081 |
| 0.29157407407407404 | 50.084 |
| 0.29158564814814814 | 50.085 |
| 0.29159722222222223 | 50.089 |
| 0.29160879629629627 | 50.089 |
| 0.29162037037037036 | 50.09 |
| 0.29163194444444446 | 50.089 |
| 0.2916435185185185 | 50.087 |
| 0.2916550925925926 | 50.086 |
| 0.3333217592592593 | 50.086 |